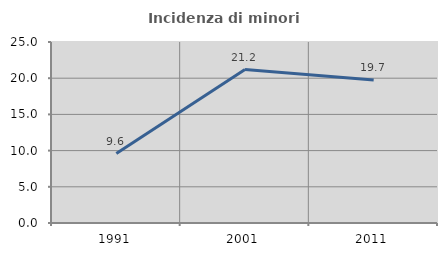
| Category | Incidenza di minori stranieri |
|---|---|
| 1991.0 | 9.589 |
| 2001.0 | 21.2 |
| 2011.0 | 19.749 |